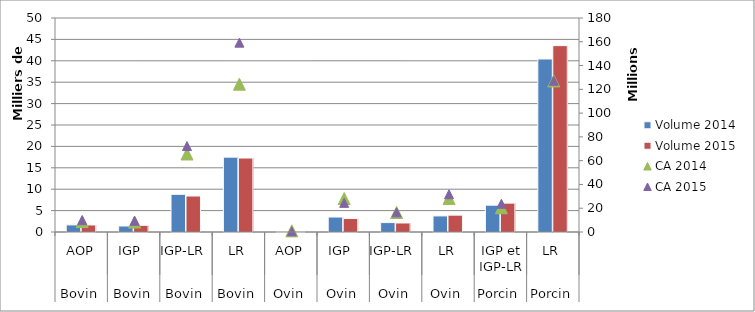
| Category | Volume 2014 | Volume 2015 |
|---|---|---|
| 0 | 1661 | 1640 |
| 1 | 1401.14 | 1559.99 |
| 2 | 8796.95 | 8404.22 |
| 3 | 17484.707 | 17279.19 |
| 4 | 85 | 71 |
| 5 | 3494 | 3148.66 |
| 6 | 2198 | 2105.38 |
| 7 | 3754 | 3934.41 |
| 8 | 6264 | 6741.36 |
| 9 | 40417 | 43538.64 |